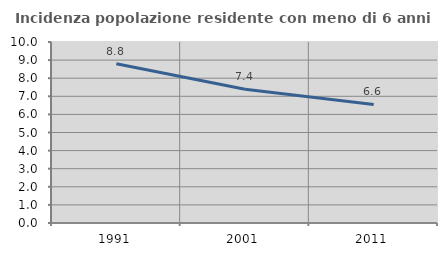
| Category | Incidenza popolazione residente con meno di 6 anni |
|---|---|
| 1991.0 | 8.797 |
| 2001.0 | 7.388 |
| 2011.0 | 6.55 |